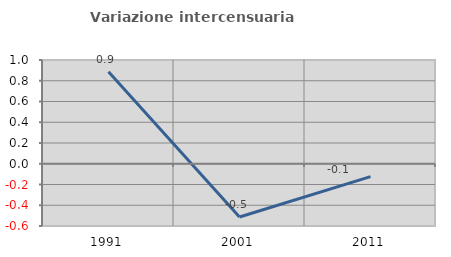
| Category | Variazione intercensuaria annua |
|---|---|
| 1991.0 | 0.887 |
| 2001.0 | -0.513 |
| 2011.0 | -0.124 |